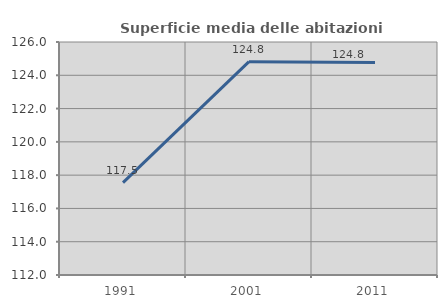
| Category | Superficie media delle abitazioni occupate |
|---|---|
| 1991.0 | 117.55 |
| 2001.0 | 124.816 |
| 2011.0 | 124.766 |